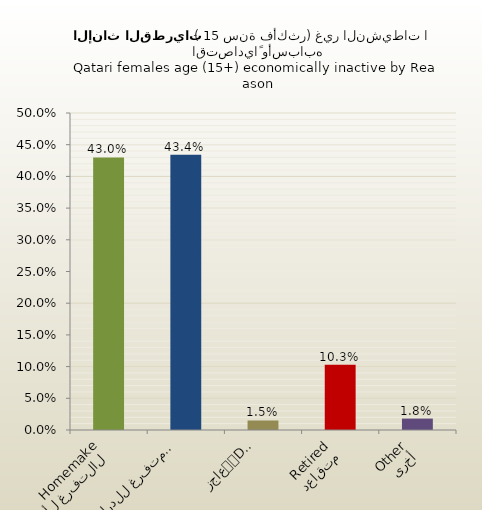
| Category | الاناث القطريات |
|---|---|
| التفرغ لأعمال المنزل
Homemaker | 0.43 |
| متفرغ للدراسة
Student | 0.434 |
| عاجز
Disabled | 0.015 |
| متقاعد
Retired | 0.103 |
| أخرى
Other | 0.018 |